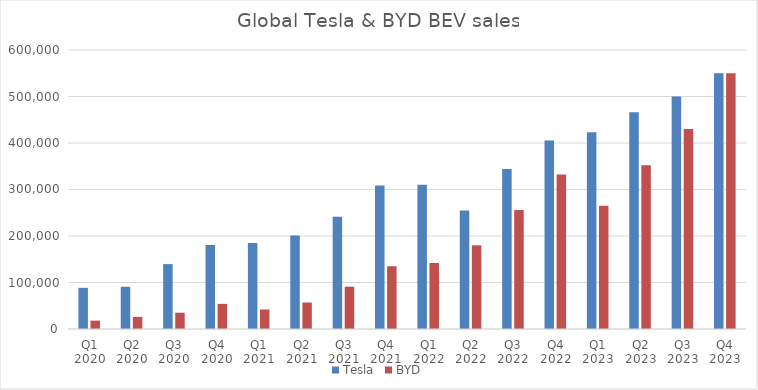
| Category | Tesla | BYD |
|---|---|---|
| Q1 2020 | 88496 | 18000 |
| Q2 2020 | 90891 | 26000 |
| Q3 2020 | 139593 | 35000 |
| Q4 2020 | 180667 | 54000 |
| Q1 2021 | 184877 | 42000 |
| Q2 2021 | 201304 | 57000 |
| Q3 2021 | 241391 | 91000 |
| Q4 2021 | 308650 | 135000 |
| Q1 2022 | 310048 | 142000 |
| Q2 2022 | 254695 | 180000 |
| Q3 2022 | 343830 | 256000 |
| Q4 2022 | 405278 | 332000 |
| Q1 2023 | 422875 | 265000 |
| Q2 2023 | 466140 | 352000 |
| Q3 2023 | 500000 | 430000 |
| Q4 2023 | 550000 | 550000 |